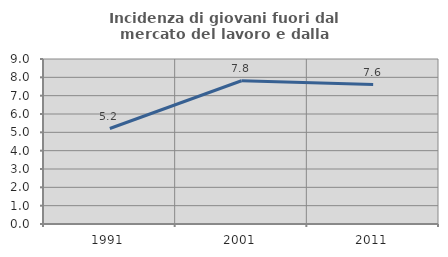
| Category | Incidenza di giovani fuori dal mercato del lavoro e dalla formazione  |
|---|---|
| 1991.0 | 5.207 |
| 2001.0 | 7.814 |
| 2011.0 | 7.608 |